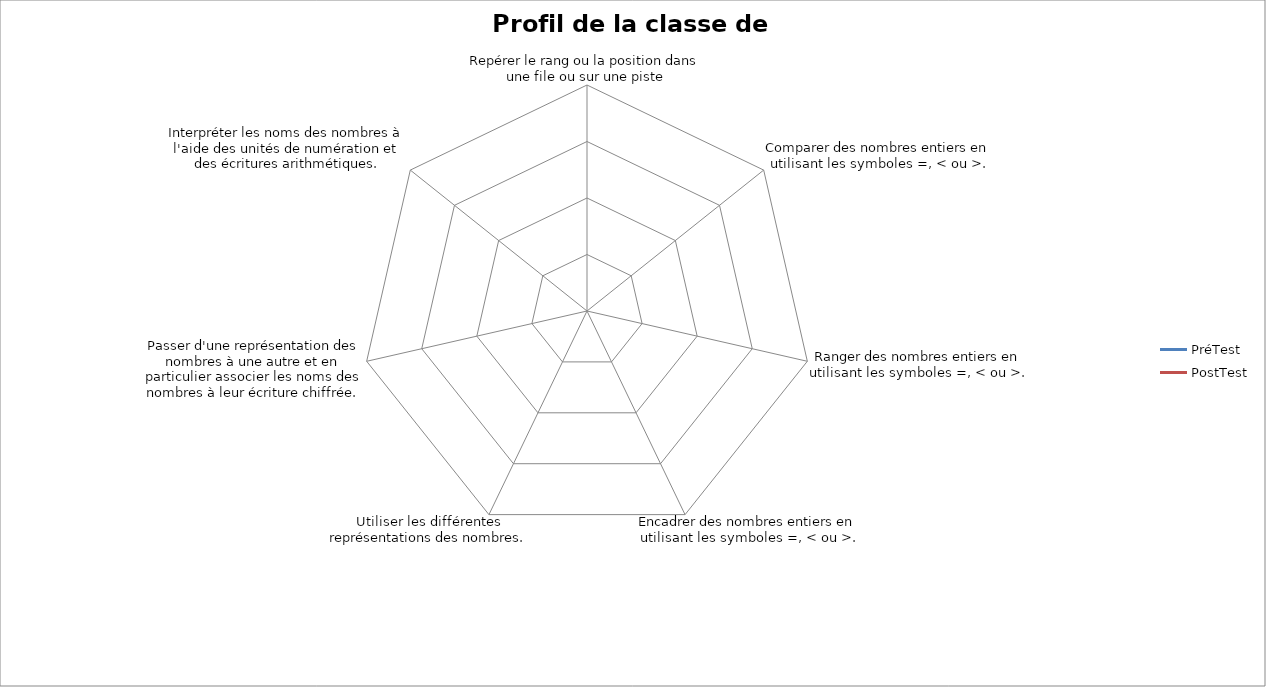
| Category | PréTest | PostTest |
|---|---|---|
| Repérer le rang ou la position dans une file ou sur une piste | 0 | 0 |
| Comparer des nombres entiers en utilisant les symboles =, < ou >. | 0 | 0 |
| Ranger des nombres entiers en utilisant les symboles =, < ou >. | 0 | 0 |
| Encadrer des nombres entiers en utilisant les symboles =, < ou >. | 0 | 0 |
| Utiliser les différentes représentations des nombres. | 0 | 0 |
| Passer d'une représentation des nombres à une autre et en particulier associer les noms des nombres à leur écriture chiffrée. | 0 | 0 |
| Interpréter les noms des nombres à l'aide des unités de numération et des écritures arithmétiques. | 0 | 0 |